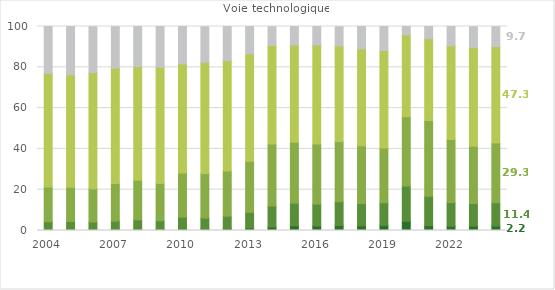
| Category | Très bien | Bien | Assez bien | Admis sans mention | Refusé |
|---|---|---|---|---|---|
| 2004 | 0.4 | 3.9 | 17 | 55.8 | 23 |
| 2005 | 0.5 | 3.9 | 16.8 | 55.1 | 23.7 |
| 2006 | 0.4 | 3.7 | 16.4 | 56.9 | 22.5 |
| 2007 | 0.5 | 4.1 | 18.5 | 56.5 | 20.3 |
| 2008 | 0.6 | 4.6 | 19.4 | 55.8 | 19.6 |
| 2009 | 0.6 | 4.2 | 18.3 | 56.9 | 20.1 |
| 2010 | 0.8 | 5.8 | 21.6 | 53.5 | 18.3 |
| 2011 | 0.7 | 5.4 | 21.8 | 54.5 | 17.5 |
| 2012 | 0.9 | 6.1 | 22.2 | 54.1 | 16.7 |
| 2013 | 1.2 | 7.7 | 25.1 | 52.6 | 13.4 |
| 2014 | 1.7 | 10.3 | 30.4 | 48.3 | 9.2 |
| 2015 | 2.3 | 11.1 | 29.9 | 47.6 | 9.2 |
| 2016 | 2.2 | 10.7 | 29.5 | 48.5 | 9.1 |
| 2017 | 2.4 | 11.7 | 29.5 | 46.9 | 9.4 |
| 2018 | 2.3 | 10.9 | 28.3 | 47.5 | 11 |
| 2019 | 2.5 | 11.1 | 26.8 | 47.8 | 11.8 |
| 2020 | 4.5 | 17.3 | 34 | 40.1 | 4.1 |
| 2021 | 2.4 | 14.4 | 37.1 | 40.2 | 5.9 |
| 2022 | 2.1 | 11.6 | 30.9 | 46 | 9.4 |
| 2023 | 2.2 | 11 | 28.1 | 48.4 | 10.2 |
| 2024p | 2.2 | 11.4 | 29.3 | 47.3 | 9.7 |